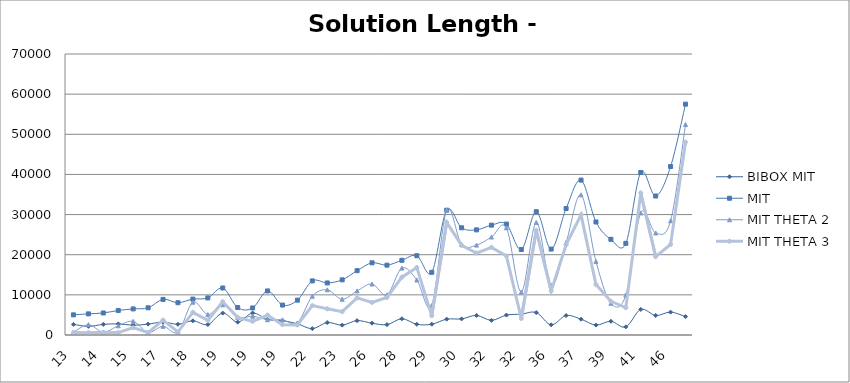
| Category | BIBOX MIT | MIT | MIT THETA 2 | MIT THETA 3 |
|---|---|---|---|---|
| 13.0 | 2652 | 5018 | 666 | 616 |
| 14.0 | 2150 | 5266 | 2586 | 586 |
| 14.0 | 2645 | 5487 | 701 | 661 |
| 14.0 | 2776 | 6110 | 2294 | 598 |
| 15.0 | 2440 | 6496 | 3402 | 1832 |
| 15.0 | 2710 | 6780 | 638 | 614 |
| 17.0 | 3226 | 8874 | 2170 | 3708 |
| 17.0 | 2674 | 8044 | 760 | 786 |
| 18.0 | 3526 | 8944 | 8168 | 5650 |
| 19.0 | 2609 | 9237 | 5089 | 3667 |
| 19.0 | 5456 | 11712 | 7524 | 8294 |
| 19.0 | 3208 | 6842 | 4388 | 4390 |
| 19.0 | 5471 | 6735 | 4675 | 3395 |
| 19.0 | 3895 | 10979 | 3803 | 4963 |
| 19.0 | 3558 | 7458 | 3786 | 2578 |
| 20.0 | 2797 | 8677 | 3013 | 2505 |
| 22.0 | 1577 | 13475 | 9669 | 7337 |
| 23.0 | 3104 | 12964 | 11260 | 6520 |
| 23.0 | 2462 | 13740 | 8902 | 5822 |
| 24.0 | 3578 | 16026 | 10988 | 9246 |
| 26.0 | 2939 | 17979 | 12703 | 8115 |
| 27.0 | 2577 | 17399 | 10001 | 9331 |
| 28.0 | 4046 | 18610 | 16670 | 14398 |
| 29.0 | 2666 | 19748 | 13704 | 16821 |
| 29.0 | 2687 | 15611 | 7349 | 4799 |
| 30.0 | 3945 | 31095 | 31095 | 28045 |
| 30.0 | 4012 | 26708 | 22536 | 22328 |
| 31.0 | 4875 | 26191 | 22395 | 20415 |
| 32.0 | 3654 | 27366 | 24394 | 21838 |
| 32.0 | 4955 | 27631 | 26701 | 19691 |
| 32.0 | 5197 | 21293 | 10705 | 4103 |
| 34.0 | 5587 | 30715 | 28033 | 26091 |
| 36.0 | 2534 | 21402 | 12385 | 10960 |
| 37.0 | 4844 | 31510 | 23026 | 22488 |
| 37.0 | 3936 | 38590 | 34916 | 29940 |
| 37.0 | 2474 | 28158 | 18338 | 12572 |
| 39.0 | 3412 | 23838 | 7894 | 8398 |
| 39.0 | 2019 | 22831 | 9947 | 6803 |
| 41.0 | 6365 | 40483 | 30415 | 35379 |
| 45.0 | 4868 | 34626 | 25416 | 19530 |
| 46.0 | 5696 | 41978 | 28466 | 22554 |
| 48.0 | 4571 | 57506 | 52432 | 48056 |